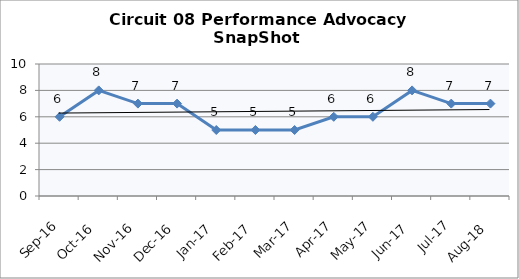
| Category | Circuit 08 |
|---|---|
| Sep-16 | 6 |
| Oct-16 | 8 |
| Nov-16 | 7 |
| Dec-16 | 7 |
| Jan-17 | 5 |
| Feb-17 | 5 |
| Mar-17 | 5 |
| Apr-17 | 6 |
| May-17 | 6 |
| Jun-17 | 8 |
| Jul-17 | 7 |
| Aug-18 | 7 |